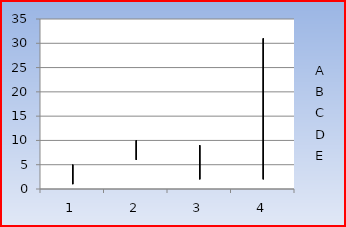
| Category | A | B | C | D | E |
|---|---|---|---|---|---|
| 0 | 1 | 2 | 3 | 4 | 5 |
| 1 | 10 | 9 | 8 | 7 | 6 |
| 2 | 5 | 4 | 3 | 2 | 9 |
| 3 | 11 | 12 | 2 | 9 | 31 |